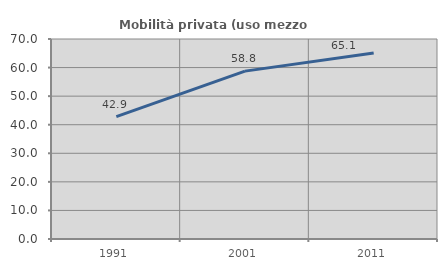
| Category | Mobilità privata (uso mezzo privato) |
|---|---|
| 1991.0 | 42.857 |
| 2001.0 | 58.753 |
| 2011.0 | 65.116 |